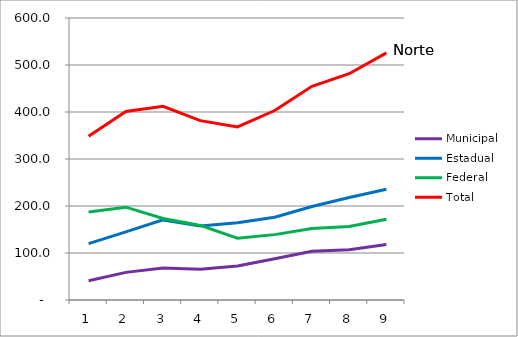
| Category | Municipal | Estadual | Federal | Total |
|---|---|---|---|---|
| 1.0 | 41 | 119.8 | 187.4 | 348.2 |